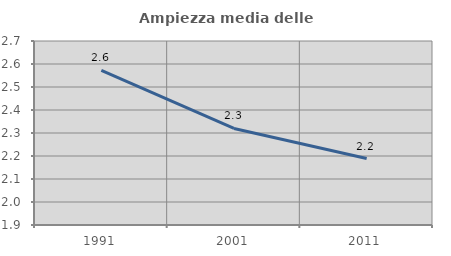
| Category | Ampiezza media delle famiglie |
|---|---|
| 1991.0 | 2.572 |
| 2001.0 | 2.32 |
| 2011.0 | 2.189 |